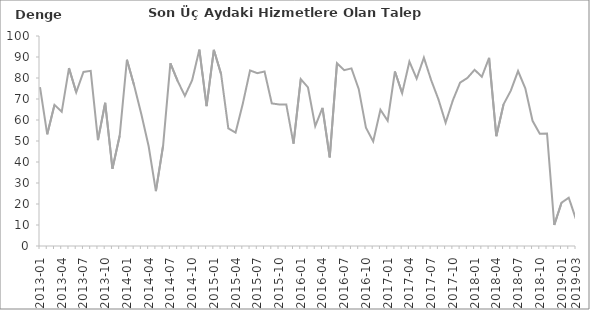
| Category | Denge  |
|---|---|
| 2013-01 | 75.7 |
|  | 53.2 |
|  | 67.2 |
| 2013-04 | 63.9 |
|  | 84.7 |
|  | 73.2 |
| 2013-07 | 82.9 |
|  | 83.4 |
|  | 50.4 |
| 2013-10 | 68.2 |
|  | 36.8 |
|  | 52.5 |
| 2014-01 | 88.7 |
|  | 76.4 |
|  | 62.6 |
| 2014-04 | 47.5 |
|  | 26.1 |
|  | 47.9 |
| 2014-07 | 87 |
|  | 78.6 |
|  | 71.5 |
| 2014-10 | 78.9 |
|  | 93.5 |
|  | 66.6 |
| 2015-01 | 93.4 |
|  | 81.9 |
|  | 56 |
| 2015-04 | 54 |
|  | 67.8 |
|  | 83.6 |
| 2015-07 | 82.3 |
|  | 83.1 |
|  | 67.9 |
| 2015-10 | 67.4 |
|  | 67.4 |
|  | 48.7 |
| 2016-01 | 79.5 |
|  | 75.5 |
|  | 57.1 |
| 2016-04 | 65.8 |
|  | 42.2 |
|  | 87 |
| 2016-07 | 83.7 |
|  | 84.6 |
|  | 74.8 |
| 2016-10 | 56.3 |
|  | 49.8 |
|  | 64.9 |
| 2017-01 | 59.6 |
|  | 83.1 |
|  | 72.8 |
| 2017-04 | 87.8 |
|  | 79.7 |
|  | 89.7 |
| 2017-07 | 79 |
|  | 69.9 |
|  | 58.7 |
| 2017-10 | 69.4 |
|  | 77.8 |
|  | 80 |
| 2018-01 | 83.9 |
|  | 80.6 |
|  | 89.6 |
| 2018-04 | 52.3 |
|  | 67.5 |
|  | 74 |
| 2018-07 | 83.3 |
|  | 75.1 |
|  | 59.6 |
| 2018-10 | 53.5 |
|  | 53.6 |
|  | 10 |
| 2019-01 | 20.6 |
|  | 23 |
| 2019-03 | 12.7 |